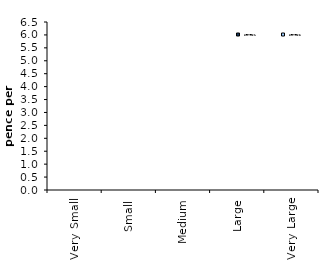
| Category | Series 0 | Series 1 |
|---|---|---|
| Very Small | 0 | 0 |
| Small | 0 | 0 |
| Medium | 0 | 0 |
| Large | 0 | 0 |
| Very Large | 0 | 0 |